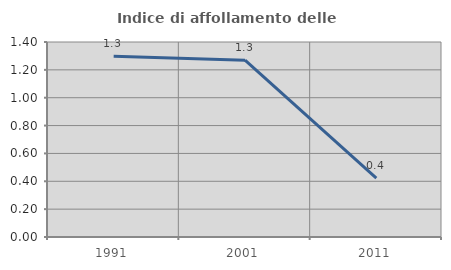
| Category | Indice di affollamento delle abitazioni  |
|---|---|
| 1991.0 | 1.297 |
| 2001.0 | 1.27 |
| 2011.0 | 0.422 |